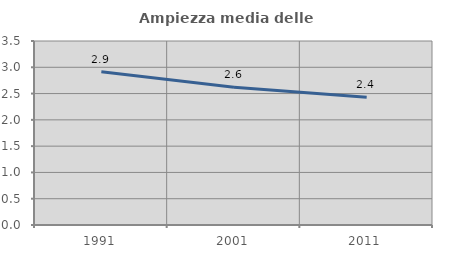
| Category | Ampiezza media delle famiglie |
|---|---|
| 1991.0 | 2.914 |
| 2001.0 | 2.622 |
| 2011.0 | 2.428 |